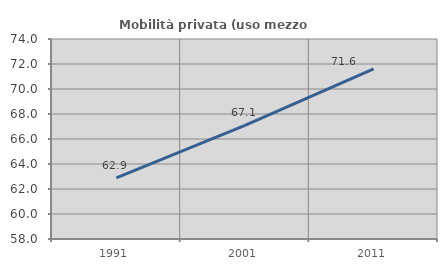
| Category | Mobilità privata (uso mezzo privato) |
|---|---|
| 1991.0 | 62.883 |
| 2001.0 | 67.082 |
| 2011.0 | 71.606 |